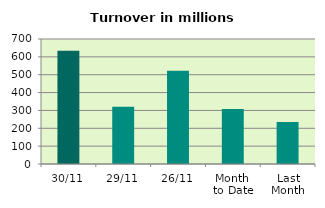
| Category | Series 0 |
|---|---|
| 30/11 | 633.782 |
| 29/11 | 320.684 |
| 26/11 | 522.053 |
| Month 
to Date | 307.664 |
| Last
Month | 235.36 |